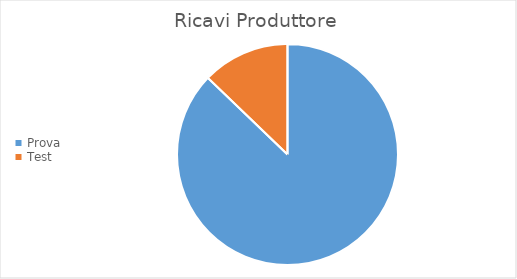
| Category | Ricavi Prodotti |
|---|---|
| Prova | 68066.667 |
| Test | 10000 |